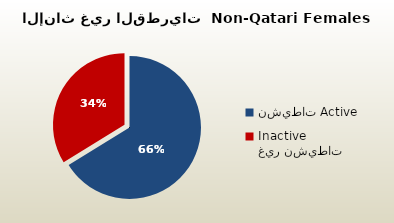
| Category | الاناث غير القطريات  Non-Qatari Females |
|---|---|
| نشيطات Active | 277672 |
| غير نشيطات Inactive | 141720 |